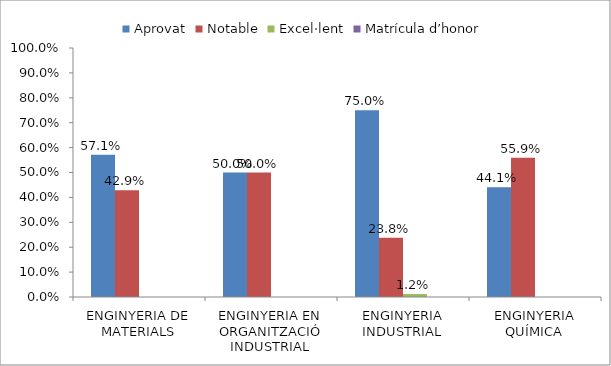
| Category | Aprovat | Notable | Excel·lent | Matrícula d’honor |
|---|---|---|---|---|
| ENGINYERIA DE MATERIALS | 0.571 | 0.429 | 0 | 0 |
| ENGINYERIA EN ORGANITZACIÓ INDUSTRIAL | 0.5 | 0.5 | 0 | 0 |
| ENGINYERIA INDUSTRIAL | 0.75 | 0.238 | 0.012 | 0 |
| ENGINYERIA QUÍMICA | 0.441 | 0.559 | 0 | 0 |